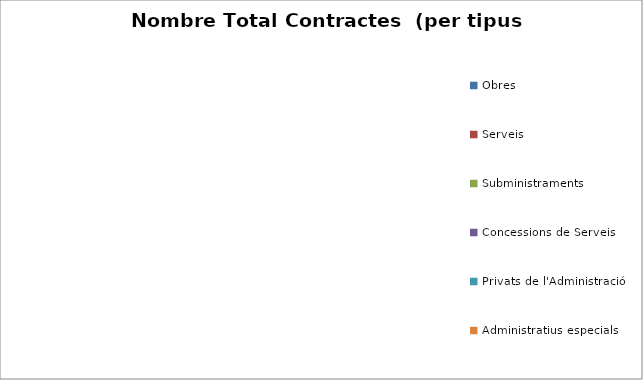
| Category | Nombre Total Contractes |
|---|---|
| Obres | 0 |
| Serveis | 0 |
| Subministraments | 0 |
| Concessions de Serveis | 0 |
| Privats de l'Administració | 0 |
| Administratius especials | 0 |